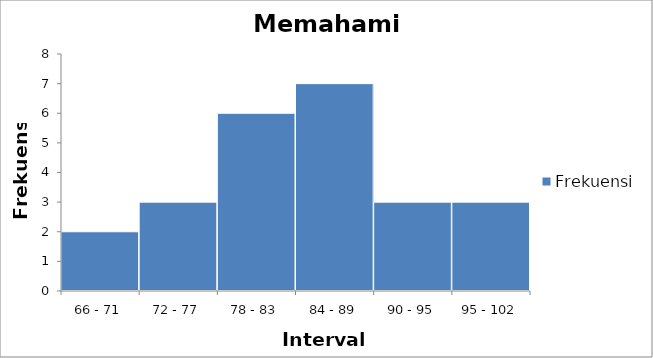
| Category | Frekuensi |
|---|---|
| 66 - 71 | 2 |
| 72 - 77 | 3 |
| 78 - 83 | 6 |
| 84 - 89 | 7 |
| 90 - 95 | 3 |
| 95 - 102 | 3 |